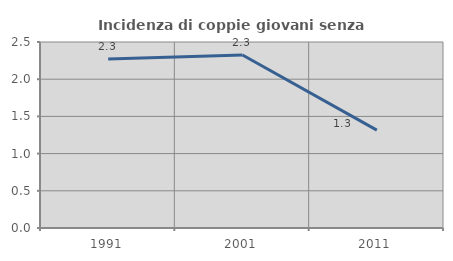
| Category | Incidenza di coppie giovani senza figli |
|---|---|
| 1991.0 | 2.273 |
| 2001.0 | 2.326 |
| 2011.0 | 1.316 |